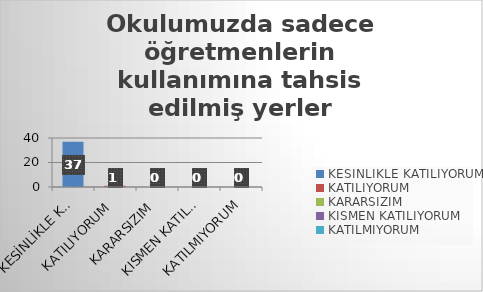
| Category | Okulumuzda sadece öğretmenlerin kullanımına tahsis edilmiş yerler yeterlidir. |
|---|---|
| KESİNLİKLE KATILIYORUM | 37 |
| KATILIYORUM | 1 |
| KARARSIZIM | 0 |
| KISMEN KATILIYORUM | 0 |
| KATILMIYORUM | 0 |